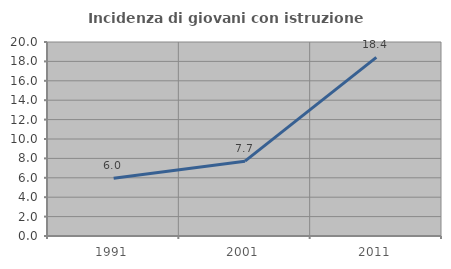
| Category | Incidenza di giovani con istruzione universitaria |
|---|---|
| 1991.0 | 5.956 |
| 2001.0 | 7.716 |
| 2011.0 | 18.42 |